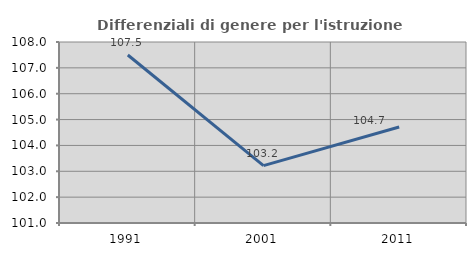
| Category | Differenziali di genere per l'istruzione superiore |
|---|---|
| 1991.0 | 107.498 |
| 2001.0 | 103.22 |
| 2011.0 | 104.71 |